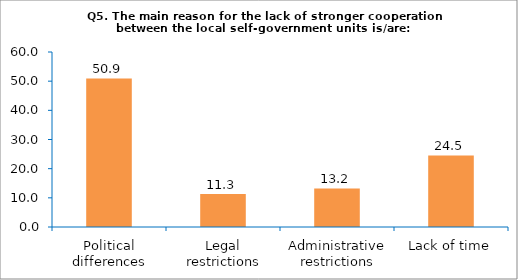
| Category | Series 0 |
|---|---|
| Political differences | 50.943 |
| Legal restrictions | 11.321 |
| Administrative restrictions | 13.208 |
| Lack of time | 24.528 |